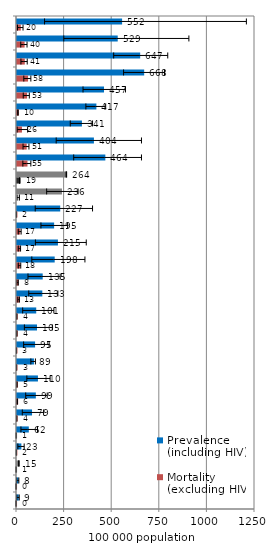
| Category | Prevalence (including HIV) | Mortality (excluding HIV) |
|---|---|---|
| Korea, DPR | 552 | 20 |
| Papua New Guinea | 529 | 40 |
| Indonesia | 647 | 41 |
| Cambodia | 668 | 58 |
| Myanmar | 457 | 53 |
| Philippines | 417 | 10 |
| Pakistan | 341 | 26 |
| Bangladesh | 404 | 51 |
| Lao PDR | 464 | 55 |
| Asia-22 | 264.045 | 18.764 |
| Thailand | 236 | 11 |
| Mongolia | 227 | 2.2 |
| India | 195 | 17 |
| Nepal | 215 | 17 |
| Viet Nam | 198 | 18 |
| Malaysia | 135 | 8 |
| Solomon Islands | 133 | 13 |
| Korea, Rep. | 101 | 3.8 |
| Macao, China | 105 | 4 |
| Hong Kong, China | 95 | 2.5 |
| China | 89 | 2.8 |
| Fiji | 110 | 4.7 |
| Sri Lanka | 99 | 6.1 |
| Brunei Darussalam | 79 | 3.6 |
| Singapore | 62 | 1 |
| Japan | 23 | 1.8 |
| OECD | 14.794 | 0.705 |
| Australia | 8.1 | 0.18 |
| New Zealand | 9.4 | 0.13 |